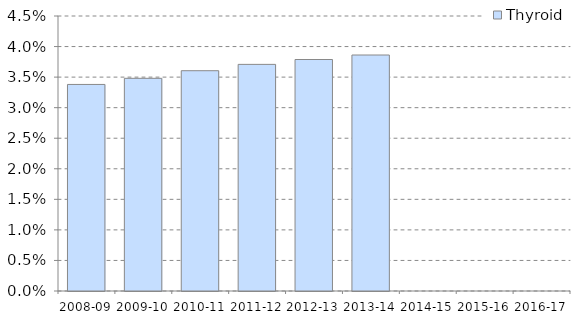
| Category | Thyroid |
|---|---|
| 2008-09 | 0.034 |
| 2009-10 | 0.035 |
| 2010-11 | 0.036 |
| 2011-12 | 0.037 |
| 2012-13 | 0.038 |
| 2013-14 | 0.039 |
| 2014-15 | 0 |
| 2015-16 | 0 |
| 2016-17 | 0 |